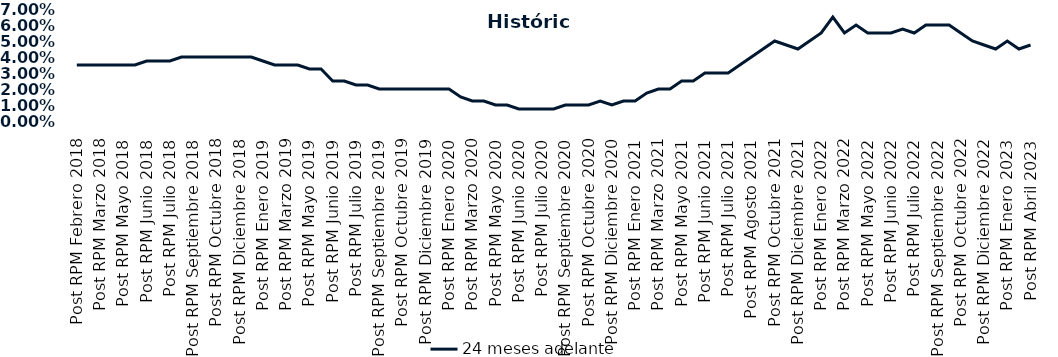
| Category | 24 meses adelante  |
|---|---|
| Post RPM Febrero 2018 | 0.035 |
| Pre RPM Marzo 2018 | 0.035 |
| Post RPM Marzo 2018 | 0.035 |
| Pre RPM Mayo 2018 | 0.035 |
| Post RPM Mayo 2018 | 0.035 |
| Pre RPM Junio 2018 | 0.035 |
| Post RPM Junio 2018 | 0.038 |
| Pre RPM Julio 2018 | 0.038 |
| Post RPM Julio 2018 | 0.038 |
| Pre RPM Septiembre 2018 | 0.04 |
| Post RPM Septiembre 2018 | 0.04 |
| Pre RPM Octubre 2018 | 0.04 |
| Post RPM Octubre 2018 | 0.04 |
| Pre RPM Diciembre 2018 | 0.04 |
| Post RPM Diciembre 2018 | 0.04 |
| Pre RPM Enero 2019 | 0.04 |
| Post RPM Enero 2019 | 0.038 |
| Pre RPM Marzo 2019 | 0.035 |
| Post RPM Marzo 2019 | 0.035 |
| Pre RPM Mayo 2019 | 0.035 |
| Post RPM Mayo 2019 | 0.032 |
| Pre RPM Junio 2019 | 0.032 |
| Post RPM Junio 2019 | 0.025 |
| Pre RPM Julio 2019 | 0.025 |
| Post RPM Julio 2019 | 0.022 |
| Pre RPM Septiembre 2019 | 0.022 |
| Post RPM Septiembre 2019 | 0.02 |
| Pre RPM Octubre 2019 | 0.02 |
| Post RPM Octubre 2019 | 0.02 |
| Pre RPM Diciembre 2019 | 0.02 |
| Post RPM Diciembre 2019 | 0.02 |
| Pre RPM Enero 2020 | 0.02 |
| Post RPM Enero 2020 | 0.02 |
| Pre RPM Marzo 2020 | 0.015 |
| Post RPM Marzo 2020 | 0.012 |
| Pre RPM Mayo 2020 | 0.012 |
| Post RPM Mayo 2020 | 0.01 |
| Pre RPM Junio 2020 | 0.01 |
| Post RPM Junio 2020 | 0.008 |
| Pre RPM Julio 2020 | 0.008 |
| Post RPM Julio 2020 | 0.008 |
| Pre RPM Septiembre 2020 | 0.008 |
| Post RPM Septiembre 2020 | 0.01 |
| Pre RPM Octubre 2020 | 0.01 |
| Post RPM Octubre 2020 | 0.01 |
| Pre RPM Diciembre 2020 | 0.012 |
| Post RPM Diciembre 2020 | 0.01 |
| Pre RPM Enero 2021 | 0.012 |
| Post RPM Enero 2021 | 0.012 |
| Pre RPM Marzo 2021 | 0.018 |
| Post RPM Marzo 2021 | 0.02 |
| Pre RPM Mayo 2021 | 0.02 |
| Post RPM Mayo 2021 | 0.025 |
| Pre RPM Junio 2021 | 0.025 |
| Post RPM Junio 2021 | 0.03 |
| Pre RPM Julio 2021 | 0.03 |
| Post RPM Julio 2021 | 0.03 |
| Pre RPM Agosto 2021 | 0.035 |
| Post RPM Agosto 2021 | 0.04 |
| Pre RPM Octubre 2021 | 0.045 |
| Post RPM Octubre 2021 | 0.05 |
| Pre RPM Diciembre 2021 | 0.048 |
| Post RPM Diciembre 2021 | 0.045 |
| Pre RPM Enero 2022 | 0.05 |
| Post RPM Enero 2022 | 0.055 |
| Pre RPM Marzo 2022 | 0.065 |
| Post RPM Marzo 2022 | 0.055 |
| Pre RPM Mayo 2022 | 0.06 |
| Post RPM Mayo 2022 | 0.055 |
| Pre RPM Junio 2022 | 0.055 |
| Post RPM Junio 2022 | 0.055 |
| Pre RPM Julio 2022 | 0.058 |
| Post RPM Julio 2022 | 0.055 |
| Pre RPM Septiembre 2022 | 0.06 |
| Post RPM Septiembre 2022 | 0.06 |
| Pre RPM Octubre 2022 | 0.06 |
| Post RPM Octubre 2022 | 0.055 |
| Pre RPM Diciembre 2022 | 0.05 |
| Post RPM Diciembre 2022 | 0.048 |
| Pre RPM Enero 2023 | 0.045 |
| Post RPM Enero 2023 | 0.05 |
| Pre RPM Abril 2023 | 0.045 |
| Post RPM Abril 2023 | 0.048 |